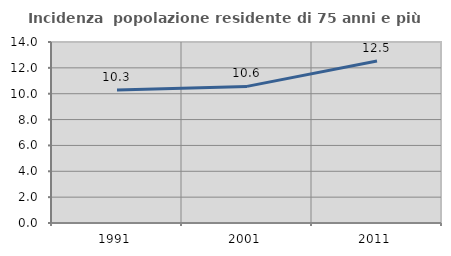
| Category | Incidenza  popolazione residente di 75 anni e più |
|---|---|
| 1991.0 | 10.293 |
| 2001.0 | 10.568 |
| 2011.0 | 12.534 |